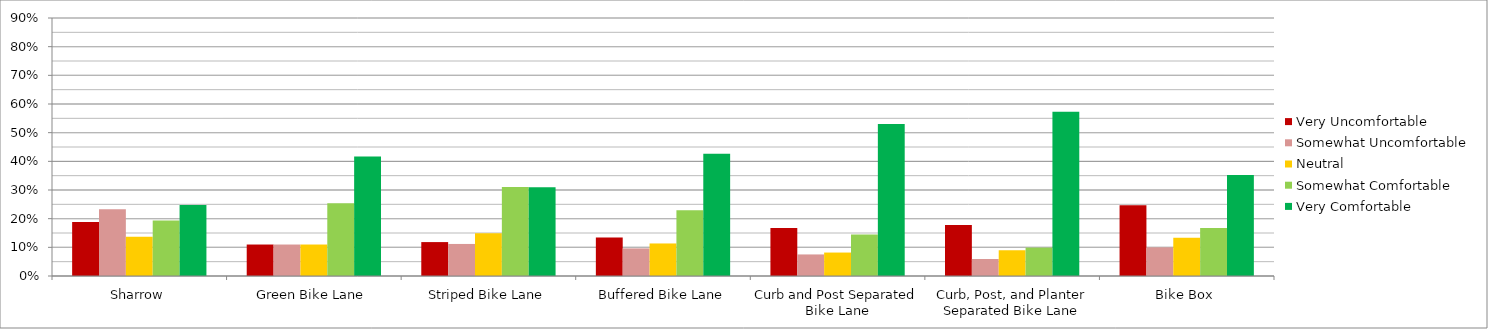
| Category | Very Uncomfortable | Somewhat Uncomfortable | Neutral | Somewhat Comfortable | Very Comfortable |
|---|---|---|---|---|---|
| Sharrow | 0.189 | 0.233 | 0.137 | 0.194 | 0.248 |
| Green Bike Lane | 0.11 | 0.11 | 0.11 | 0.254 | 0.417 |
| Striped Bike Lane | 0.118 | 0.112 | 0.15 | 0.311 | 0.31 |
| Buffered Bike Lane | 0.135 | 0.096 | 0.114 | 0.23 | 0.426 |
| Curb and Post Separated Bike Lane | 0.168 | 0.075 | 0.082 | 0.145 | 0.53 |
| Curb, Post, and Planter Separated Bike Lane | 0.178 | 0.059 | 0.09 | 0.099 | 0.573 |
| Bike Box | 0.247 | 0.1 | 0.134 | 0.168 | 0.352 |